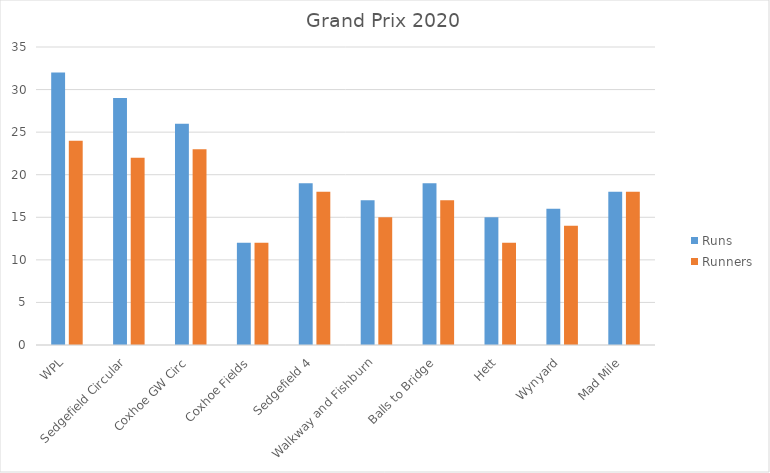
| Category | Runs | Runners |
|---|---|---|
| WPL | 32 | 24 |
| Sedgefield Circular | 29 | 22 |
| Coxhoe GW Circ | 26 | 23 |
| Coxhoe Fields | 12 | 12 |
| Sedgefield 4 | 19 | 18 |
| Walkway and Fishburn | 17 | 15 |
| Balls to Bridge | 19 | 17 |
| Hett | 15 | 12 |
| Wynyard | 16 | 14 |
| Mad Mile | 18 | 18 |